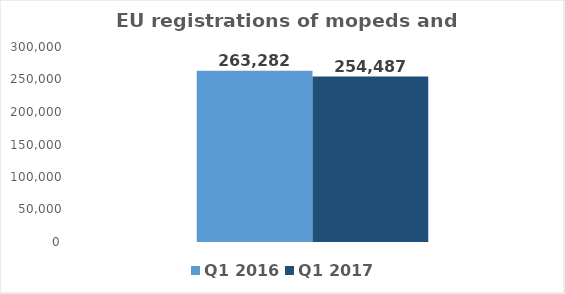
| Category | Q1 2016 | Q1 2017 |
|---|---|---|
| TOTAL | 263282 | 254487 |